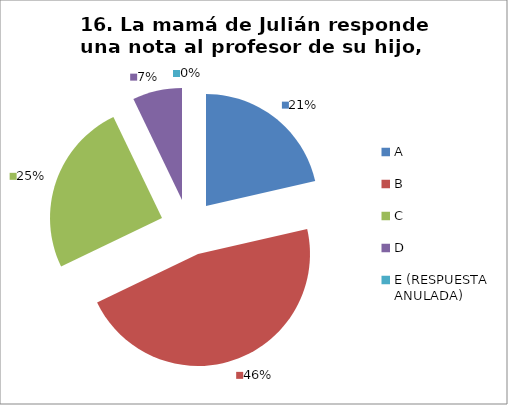
| Category | CANTIDAD DE RESPUESTAS PREGUNTA (16) | PORCENTAJE |
|---|---|---|
| A | 6 | 0.214 |
| B | 13 | 0.464 |
| C | 7 | 0.25 |
| D | 2 | 0.071 |
| E (RESPUESTA ANULADA) | 0 | 0 |